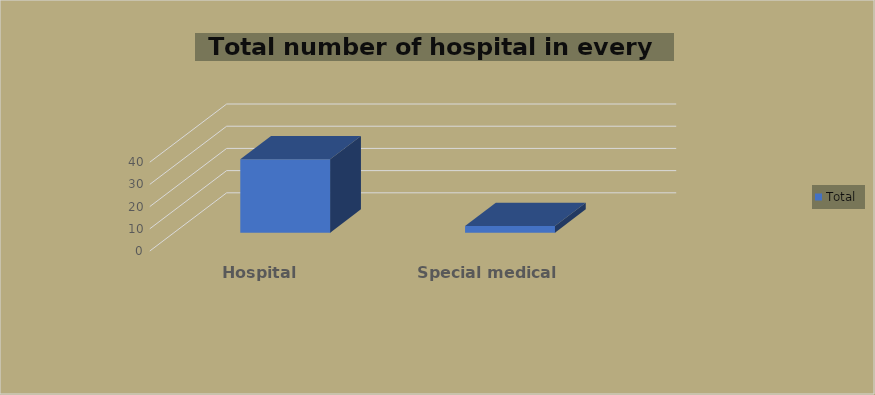
| Category | Total |
|---|---|
| Hospital | 33 |
| Special medical institution | 3 |